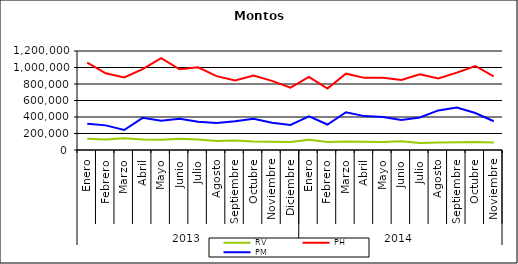
| Category | RV | PH | PM |
|---|---|---|---|
| 0 | 136808.804 | 1058774.967 | 316751.291 |
| 1 | 127193.421 | 930111.334 | 298480.292 |
| 2 | 142052.509 | 880100.908 | 242691.68 |
| 3 | 126637.277 | 980038.371 | 389833.89 |
| 4 | 123189.846 | 1112542.201 | 355777.139 |
| 5 | 135184.022 | 977877.296 | 379782.022 |
| 6 | 127790.361 | 1003315.643 | 342842.568 |
| 7 | 110532.346 | 895717.973 | 326616.455 |
| 8 | 114630.859 | 843607.598 | 348985.725 |
| 9 | 102262.08 | 901170.281 | 379642.157 |
| 10 | 99242.352 | 837424.505 | 330278.777 |
| 11 | 96243.301 | 754952.55 | 304473.582 |
| 12 | 124770.971 | 885857.327 | 408057.686 |
| 13 | 96987.292 | 744736.746 | 309218.036 |
| 14 | 103624.997 | 925209.281 | 458118.752 |
| 15 | 100007.683 | 874534.649 | 410841.727 |
| 16 | 96199.147 | 875356.86 | 399197.561 |
| 17 | 104965.63 | 848001.408 | 363776.247 |
| 18 | 85979.134 | 918529.646 | 394798.235 |
| 19 | 91006.222 | 867037.612 | 479726.319 |
| 20 | 95061.186 | 938312.305 | 516086.875 |
| 21 | 98427.295 | 1018217.103 | 448738.646 |
| 22 | 91856.212 | 892374.454 | 348926.607 |